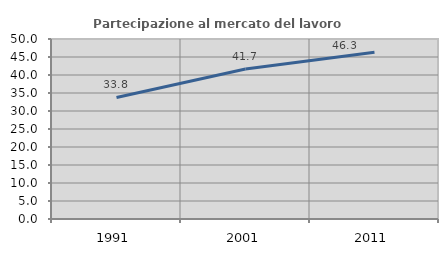
| Category | Partecipazione al mercato del lavoro  femminile |
|---|---|
| 1991.0 | 33.757 |
| 2001.0 | 41.674 |
| 2011.0 | 46.306 |